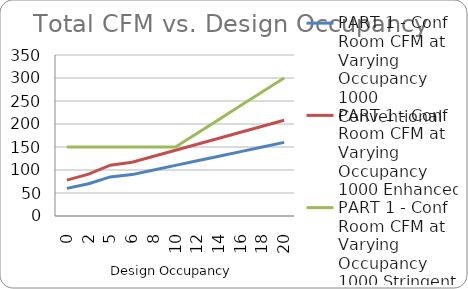
| Category | PART 1 - Conf Room CFM at Varying Occupancy |
|---|---|
| 0.0 | 150 |
| 2.0 | 150 |
| 5.0 | 150 |
| 6.0 | 150 |
| 8.0 | 150 |
| 10.0 | 150 |
| 12.0 | 180 |
| 14.0 | 210 |
| 16.0 | 240 |
| 18.0 | 270 |
| 20.0 | 300 |